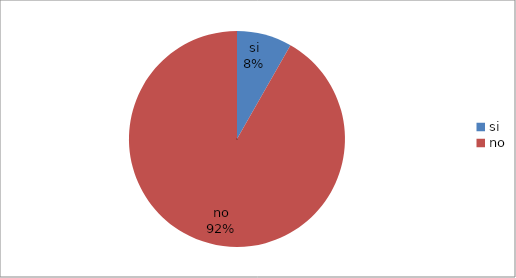
| Category | Series 0 |
|---|---|
| si | 33 |
| no | 367 |